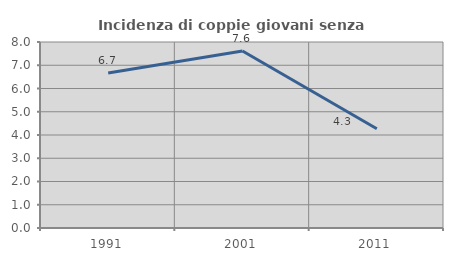
| Category | Incidenza di coppie giovani senza figli |
|---|---|
| 1991.0 | 6.667 |
| 2001.0 | 7.614 |
| 2011.0 | 4.27 |